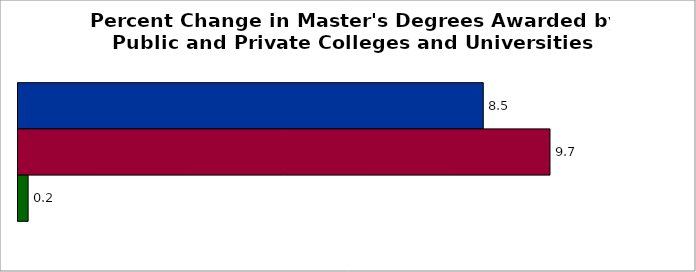
| Category | 50 states and D.C. | SREB states | State |
|---|---|---|---|
| 0 | 8.498 | 9.717 | 0.185 |